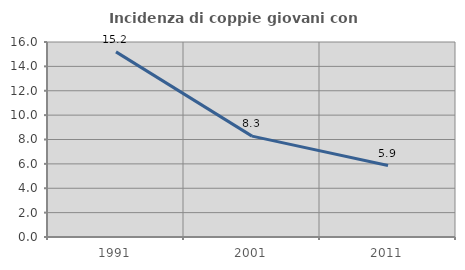
| Category | Incidenza di coppie giovani con figli |
|---|---|
| 1991.0 | 15.189 |
| 2001.0 | 8.277 |
| 2011.0 | 5.865 |